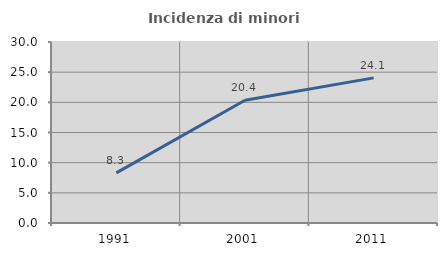
| Category | Incidenza di minori stranieri |
|---|---|
| 1991.0 | 8.301 |
| 2001.0 | 20.356 |
| 2011.0 | 24.056 |